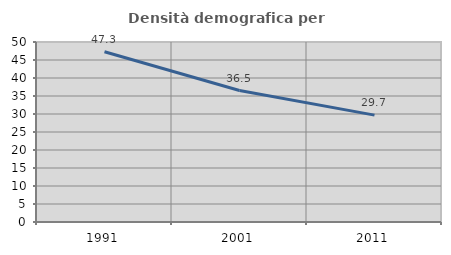
| Category | Densità demografica |
|---|---|
| 1991.0 | 47.28 |
| 2001.0 | 36.519 |
| 2011.0 | 29.681 |